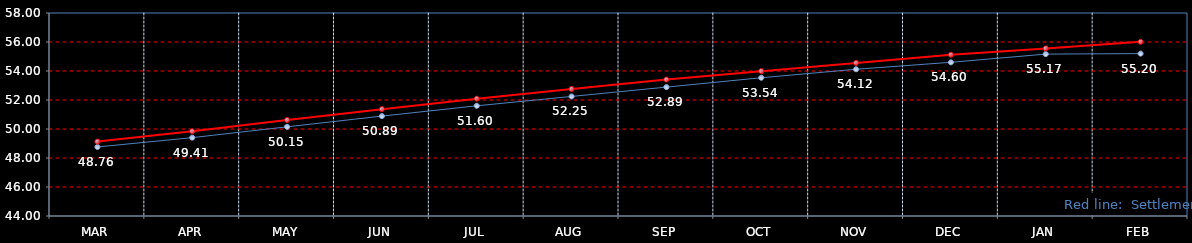
| Category | Last | Settlement |
|---|---|---|
| MAR | 48.76 | 49.13 |
| APR | 49.405 | 49.84 |
| MAY | 50.15 | 50.62 |
| JUN | 50.89 | 51.37 |
| JUL | 51.6 | 52.09 |
| AUG | 52.245 | 52.76 |
| SEP | 52.89 | 53.41 |
| OCT | 53.535 | 53.99 |
| NOV | 54.12 | 54.56 |
| DEC | 54.6 | 55.12 |
| JAN | 55.165 | 55.56 |
| FEB | 55.2 | 56.01 |